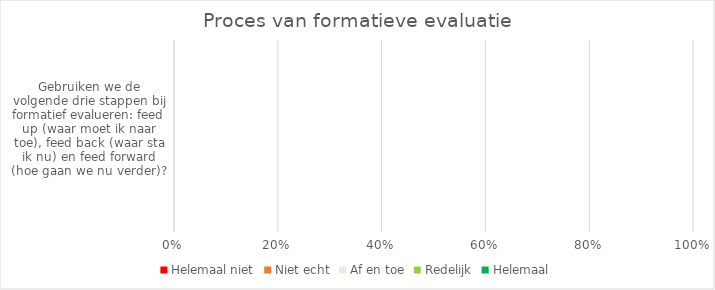
| Category | Helemaal niet | Niet echt | Af en toe | Redelijk | Helemaal |
|---|---|---|---|---|---|
| Gebruiken we de volgende drie stappen bij formatief evalueren: feed up (waar moet ik naar toe), feed back (waar sta ik nu) en feed forward (hoe gaan we nu verder)? | 0 | 0 | 0 | 0 | 0 |